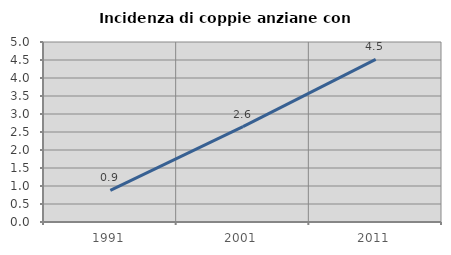
| Category | Incidenza di coppie anziane con figli |
|---|---|
| 1991.0 | 0.877 |
| 2001.0 | 2.649 |
| 2011.0 | 4.518 |